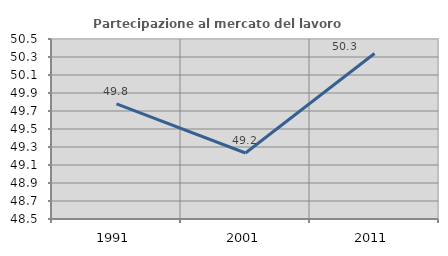
| Category | Partecipazione al mercato del lavoro  femminile |
|---|---|
| 1991.0 | 49.779 |
| 2001.0 | 49.233 |
| 2011.0 | 50.338 |